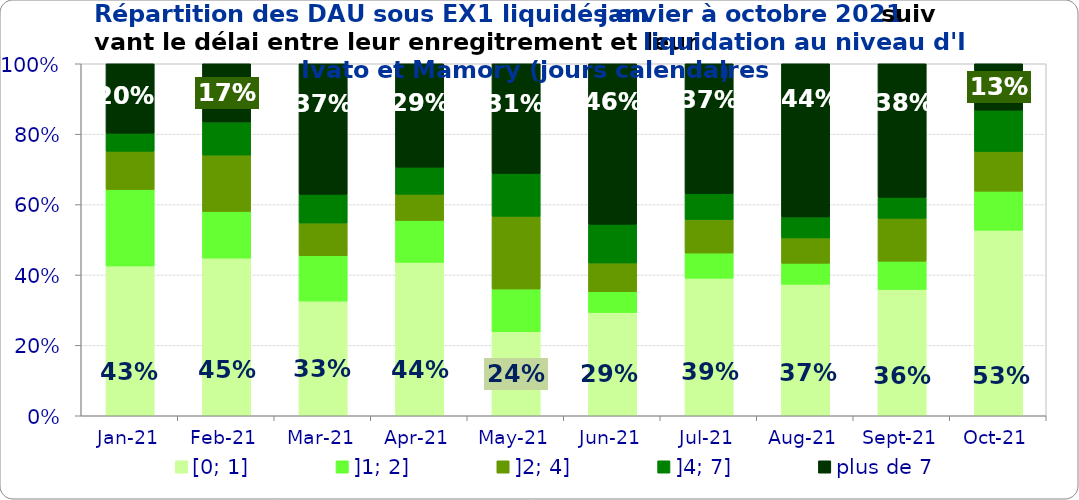
| Category | [0; 1] | ]1; 2] | ]2; 4] | ]4; 7] | plus de 7 |
|---|---|---|---|---|---|
| 2021-01-01 | 0.426 | 0.217 | 0.109 | 0.051 | 0.197 |
| 2021-02-01 | 0.448 | 0.132 | 0.16 | 0.094 | 0.165 |
| 2021-03-01 | 0.326 | 0.129 | 0.093 | 0.081 | 0.371 |
| 2021-04-01 | 0.436 | 0.119 | 0.075 | 0.077 | 0.294 |
| 2021-05-01 | 0.239 | 0.122 | 0.206 | 0.122 | 0.312 |
| 2021-06-01 | 0.293 | 0.059 | 0.081 | 0.11 | 0.456 |
| 2021-07-01 | 0.391 | 0.071 | 0.095 | 0.073 | 0.369 |
| 2021-08-01 | 0.374 | 0.06 | 0.072 | 0.06 | 0.435 |
| 2021-09-01 | 0.359 | 0.08 | 0.122 | 0.06 | 0.379 |
| 2021-10-01 | 0.527 | 0.111 | 0.113 | 0.117 | 0.132 |